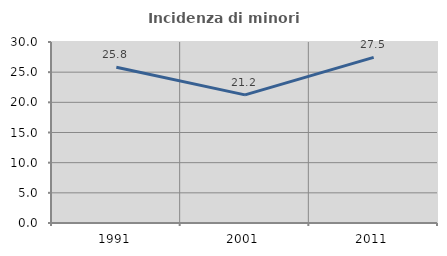
| Category | Incidenza di minori stranieri |
|---|---|
| 1991.0 | 25.806 |
| 2001.0 | 21.233 |
| 2011.0 | 27.455 |